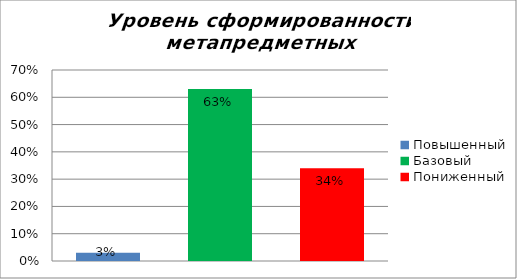
| Category | Уровень сформированности метапредметных результатов |
|---|---|
| Повышенный | 0.03 |
| Базовый | 0.63 |
| Пониженный | 0.34 |